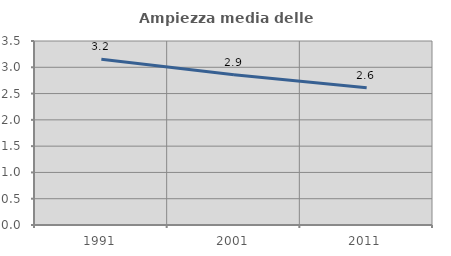
| Category | Ampiezza media delle famiglie |
|---|---|
| 1991.0 | 3.152 |
| 2001.0 | 2.859 |
| 2011.0 | 2.613 |